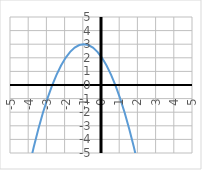
| Category | y |
|---|---|
| -5.0 | -13 |
| -4.75 | -11.062 |
| -4.5 | -9.25 |
| -4.25 | -7.562 |
| -4.0 | -6 |
| -3.75 | -4.562 |
| -3.5 | -3.25 |
| -3.25 | -2.062 |
| -3.0 | -1 |
| -2.75 | -0.062 |
| -2.5 | 0.75 |
| -2.25 | 1.438 |
| -2.0 | 2 |
| -1.75 | 2.438 |
| -1.5 | 2.75 |
| -1.25 | 2.938 |
| -1.0 | 3 |
| -0.75 | 2.938 |
| -0.5 | 2.75 |
| -0.25 | 2.438 |
| 0.0 | 2 |
| 0.25 | 1.438 |
| 0.5 | 0.75 |
| 0.75 | -0.062 |
| 1.0 | -1 |
| 1.25 | -2.062 |
| 1.5 | -3.25 |
| 1.75 | -4.562 |
| 2.0 | -6 |
| 2.25 | -7.562 |
| 2.5 | -9.25 |
| 2.75 | -11.062 |
| 3.0 | -13 |
| 3.25 | -15.062 |
| 3.5 | -17.25 |
| 3.75 | -19.562 |
| 4.0 | -22 |
| 4.25 | -24.562 |
| 4.5 | -27.25 |
| 4.75 | -30.062 |
| 5.0 | -33 |